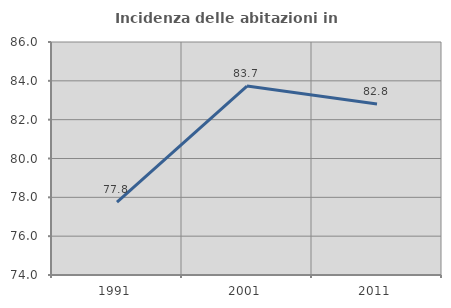
| Category | Incidenza delle abitazioni in proprietà  |
|---|---|
| 1991.0 | 77.758 |
| 2001.0 | 83.73 |
| 2011.0 | 82.807 |